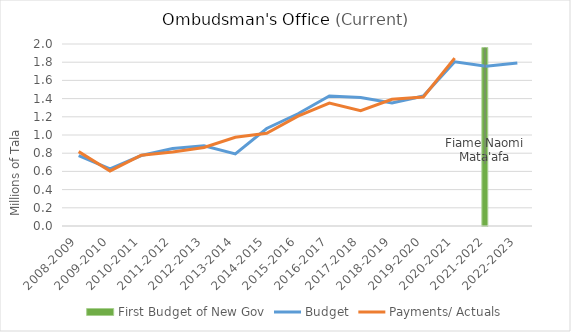
| Category | First Budget of New Gov |
|---|---|
| 2008-2009 | 0 |
| 2009-2010 | 0 |
| 2010-2011 | 0 |
| 2011-2012 | 0 |
| 2012-2013 | 0 |
| 2013-2014 | 0 |
| 2014-2015 | 0 |
| 2015-2016 | 0 |
| 2016-2017 | 0 |
| 2017-2018 | 0 |
| 2018-2019 | 0 |
| 2019-2020 | 0 |
| 2020-2021 | 0 |
| 2021-2022 | 1 |
| 2022-2023 | 0 |